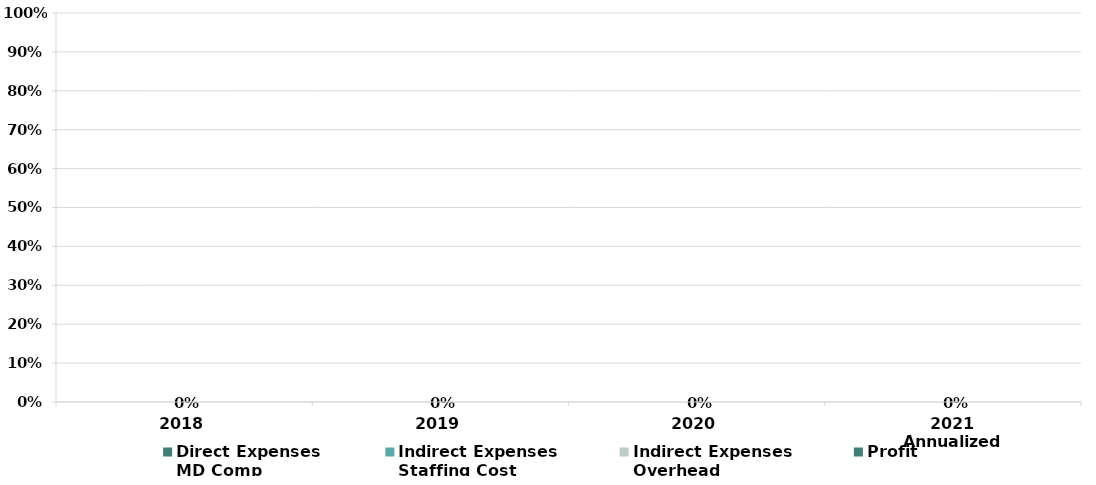
| Category | Direct Expenses 
MD Comp   | Indirect Expenses 
Staffing Cost | Indirect Expenses 
Overhead | Profit  |
|---|---|---|---|---|
| 2018 | 0 | 0 | 0 | 0 |
| 2019 | 0 | 0 | 0 | 0 |
| 2020 | 0 | 0 | 0 | 0 |
| 2021 Annualized | 0 | 0 | 0 | 0 |